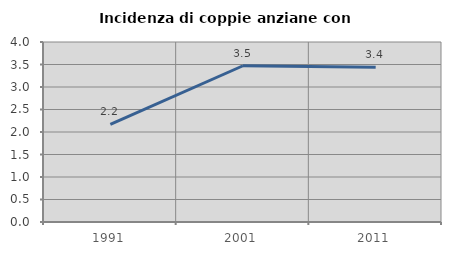
| Category | Incidenza di coppie anziane con figli |
|---|---|
| 1991.0 | 2.171 |
| 2001.0 | 3.472 |
| 2011.0 | 3.438 |